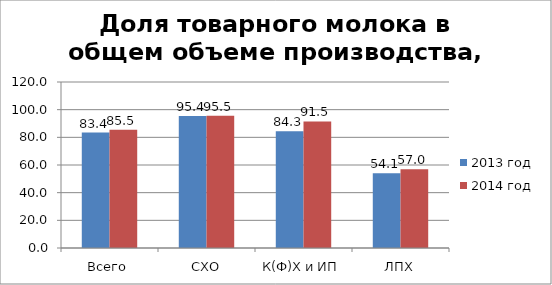
| Category | 2013 год | 2014 год |
|---|---|---|
| Всего | 83.428 | 85.533 |
| СХО | 95.386 | 95.526 |
| К(Ф)Х и ИП | 84.332 | 91.494 |
| ЛПХ | 54.051 | 57.006 |